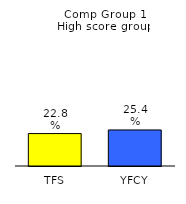
| Category | Series 0 |
|---|---|
| TFS | 0.228 |
| YFCY | 0.254 |